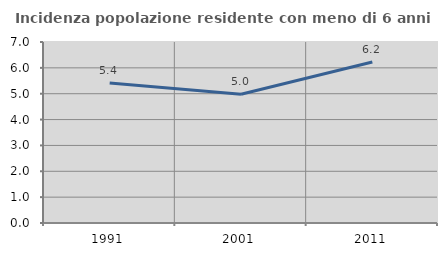
| Category | Incidenza popolazione residente con meno di 6 anni |
|---|---|
| 1991.0 | 5.415 |
| 2001.0 | 4.978 |
| 2011.0 | 6.224 |